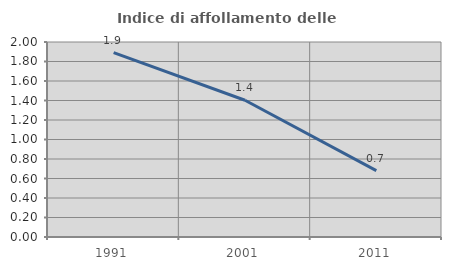
| Category | Indice di affollamento delle abitazioni  |
|---|---|
| 1991.0 | 1.891 |
| 2001.0 | 1.403 |
| 2011.0 | 0.681 |